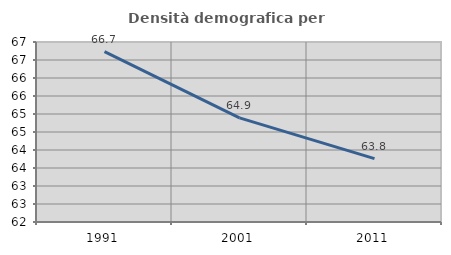
| Category | Densità demografica |
|---|---|
| 1991.0 | 66.733 |
| 2001.0 | 64.891 |
| 2011.0 | 63.762 |